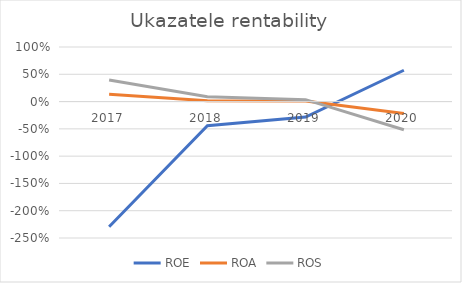
| Category | ROE | ROA | ROS |
|---|---|---|---|
| 2017.0 | -2.294 | 0.134 | 0.395 |
| 2018.0 | -0.443 | 0.015 | 0.087 |
| 2019.0 | -0.284 | 0.012 | 0.036 |
| 2020.0 | 0.574 | -0.218 | -0.516 |